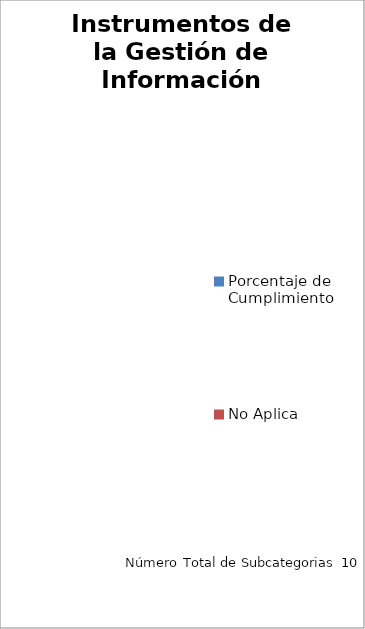
| Category | Instrumentos de la Gestión de Información Pública |
|---|---|
| Porcentaje de Cumplimiento | 0 |
| No Aplica | 0 |